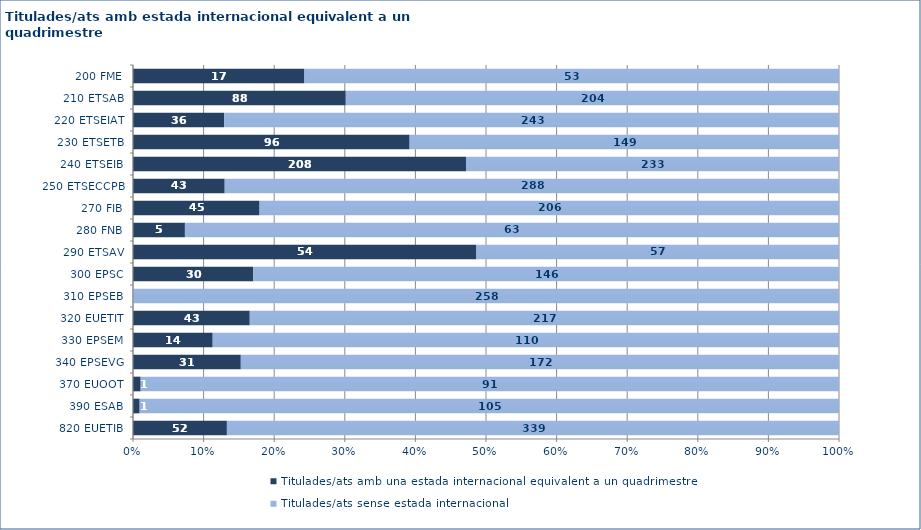
| Category | Titulades/ats amb una estada internacional equivalent a un quadrimestre | Titulades/ats sense estada internacional |
|---|---|---|
| 820 EUETIB | 52 | 339 |
| 390 ESAB | 1 | 105 |
| 370 EUOOT | 1 | 91 |
| 340 EPSEVG | 31 | 172 |
| 330 EPSEM | 14 | 110 |
| 320 EUETIT | 43 | 217 |
| 310 EPSEB | 0 | 258 |
| 300 EPSC | 30 | 146 |
| 290 ETSAV | 54 | 57 |
| 280 FNB | 5 | 63 |
| 270 FIB | 45 | 206 |
| 250 ETSECCPB | 43 | 288 |
| 240 ETSEIB | 208 | 233 |
| 230 ETSETB | 96 | 149 |
| 220 ETSEIAT | 36 | 243 |
| 210 ETSAB | 88 | 204 |
| 200 FME | 17 | 53 |